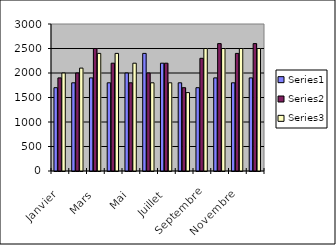
| Category | Series 0 | Series 1 | Series 2 |
|---|---|---|---|
| Janvier | 1700 | 1900 | 2000 |
| Février | 1800 | 2000 | 2100 |
| Mars | 1900 | 2500 | 2400 |
| Avril | 1800 | 2200 | 2400 |
| Mai | 2000 | 1800 | 2200 |
| Juin | 2400 | 2000 | 1800 |
| Juillet | 2200 | 2200 | 1800 |
| Août | 1800 | 1700 | 1600 |
| Septembre | 1700 | 2300 | 2500 |
| Octobre | 1900 | 2600 | 2500 |
| Novembre | 1800 | 2400 | 2500 |
| Décembre | 1900 | 2600 | 2500 |